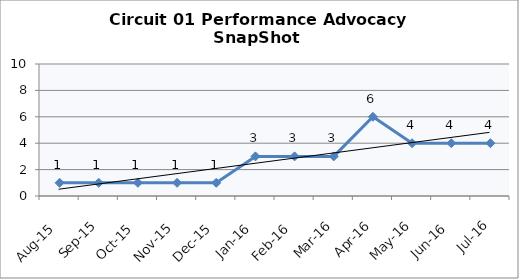
| Category | Circuit 01 |
|---|---|
| Aug-15 | 1 |
| Sep-15 | 1 |
| Oct-15 | 1 |
| Nov-15 | 1 |
| Dec-15 | 1 |
| Jan-16 | 3 |
| Feb-16 | 3 |
| Mar-16 | 3 |
| Apr-16 | 6 |
| May-16 | 4 |
| Jun-16 | 4 |
| Jul-16 | 4 |